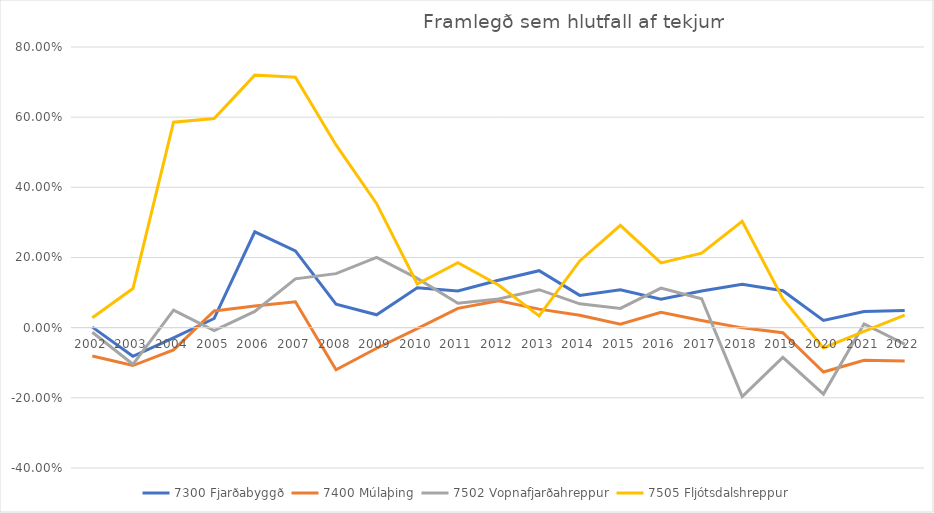
| Category | 7300 Fjarðabyggð | 7400 Múlaþing | 7502 Vopnafjarðahreppur | 7505 Fljótsdalshreppur |
|---|---|---|---|---|
| 2002.0 | 0.002 | -0.081 | -0.013 | 0.029 |
| 2003.0 | -0.081 | -0.108 | -0.104 | 0.112 |
| 2004.0 | -0.029 | -0.063 | 0.05 | 0.586 |
| 2005.0 | 0.026 | 0.047 | -0.008 | 0.596 |
| 2006.0 | 0.273 | 0.062 | 0.046 | 0.72 |
| 2007.0 | 0.219 | 0.074 | 0.139 | 0.714 |
| 2008.0 | 0.067 | -0.12 | 0.154 | 0.521 |
| 2009.0 | 0.037 | -0.059 | 0.2 | 0.353 |
| 2010.0 | 0.114 | -0.003 | 0.141 | 0.124 |
| 2011.0 | 0.105 | 0.055 | 0.069 | 0.185 |
| 2012.0 | 0.135 | 0.077 | 0.082 | 0.121 |
| 2013.0 | 0.162 | 0.053 | 0.108 | 0.034 |
| 2014.0 | 0.092 | 0.036 | 0.068 | 0.19 |
| 2015.0 | 0.108 | 0.01 | 0.055 | 0.292 |
| 2016.0 | 0.081 | 0.044 | 0.113 | 0.184 |
| 2017.0 | 0.104 | 0.021 | 0.082 | 0.212 |
| 2018.0 | 0.124 | -0.001 | -0.197 | 0.303 |
| 2019.0 | 0.105 | -0.014 | -0.085 | 0.083 |
| 2020.0 | 0.02 | -0.126 | -0.189 | -0.058 |
| 2021.0 | 0.046 | -0.093 | 0.011 | -0.011 |
| 2022.0 | 0.049 | -0.095 | -0.047 | 0.036 |